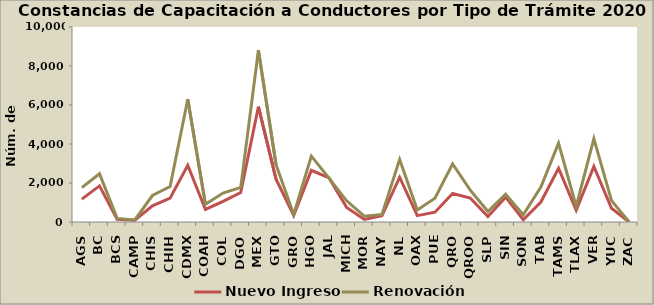
| Category | Nuevo Ingreso | Renovación |
|---|---|---|
| AGS | 1173 | 1766 |
| BC | 1852 | 2476 |
| BCS | 137 | 185 |
| CAMP | 95 | 109 |
| CHIS | 831 | 1357 |
| CHIH | 1224 | 1819 |
| CDMX | 2911 | 6291 |
| COAH | 643 | 909 |
| COL | 1062 | 1483 |
| DGO | 1512 | 1777 |
| MEX | 5913 | 8808 |
| GTO | 2192 | 2936 |
| GRO | 333 | 386 |
| HGO | 2650 | 3381 |
| JAL | 2259 | 2247 |
| MICH | 742 | 1086 |
| MOR | 132 | 301 |
| NAY | 324 | 387 |
| NL | 2295 | 3211 |
| OAX | 327 | 615 |
| PUE | 501 | 1217 |
| QRO | 1465 | 2979 |
| QROO | 1232 | 1637 |
| SLP | 282 | 535 |
| SIN | 1272 | 1421 |
| SON | 116 | 369 |
| TAB | 1026 | 1786 |
| TAMS | 2755 | 4041 |
| TLAX | 601 | 795 |
| VER | 2848 | 4274 |
| YUC | 707 | 1095 |
| ZAC | 0 | 0 |